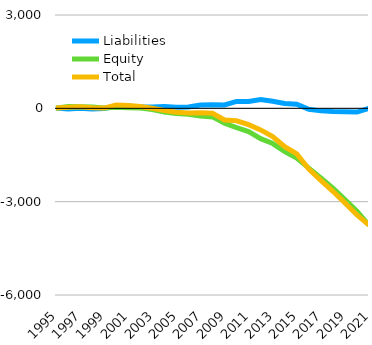
| Category | Liabilities  | Equity  | Total  |
|---|---|---|---|
| 1995 | 7 | 0 | 7 |
| 1996 | -24 | 60 | 36 |
| 1997 | 1 | 52 | 53 |
| 1998 | -25 | 41 | 16 |
| 1999 | -7 | 14 | 7 |
| 2000 | 73 | 36 | 109 |
| 2001 | 71 | 18 | 89 |
| 2002 | 45 | 11 | 56 |
| 2003 | 40 | -37 | 3 |
| 2004 | 55 | -122 | -67 |
| 2005 | 35 | -163 | -128 |
| 2006 | 40 | -193 | -153 |
| 2007 | 104 | -246 | -142 |
| 2008 | 114 | -275 | -161 |
| 2009 | 108 | -481 | -373 |
| 2010 | 223 | -623 | -400 |
| 2011 | 221 | -747 | -526 |
| 2012 | 281 | -974 | -693 |
| 2013 | 226 | -1132 | -906 |
| 2014 | 158 | -1390 | -1232 |
| 2015 | 134 | -1600 | -1466 |
| 2016 | -28 | -1921 | -1949 |
| 2017 | -81 | -2236 | -2317 |
| 2018 | -100 | -2566 | -2666 |
| 2019 | -108 | -2932 | -3040 |
| 2020 | -121 | -3308 | -3429 |
| 2021 | 2.8 | -3754.6 | -3751.8 |